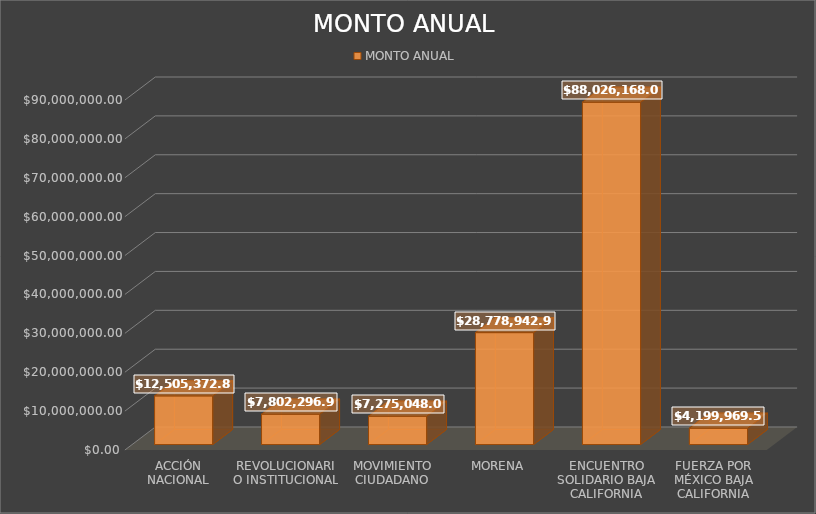
| Category | MONTO ANUAL |
|---|---|
| ACCIÓN NACIONAL | 12505372.88 |
| REVOLUCIONARIO INSTITUCIONAL | 7802296.92 |
| MOVIMIENTO CIUDADANO | 7275048.03 |
| MORENA | 28778942.9 |
| ENCUENTRO SOLIDARIO BAJA CALIFORNIA | 88026168.04 |
| FUERZA POR MÉXICO BAJA CALIFORNIA | 4199969.5 |